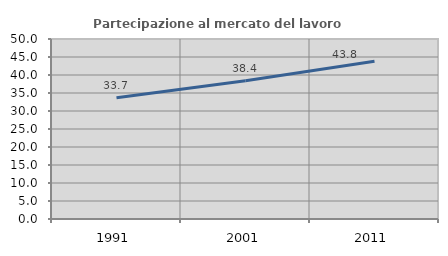
| Category | Partecipazione al mercato del lavoro  femminile |
|---|---|
| 1991.0 | 33.667 |
| 2001.0 | 38.375 |
| 2011.0 | 43.842 |